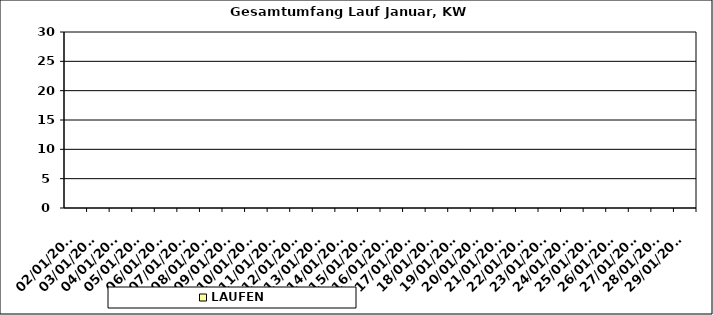
| Category | LAUFEN |
|---|---|
| 02/01/2023 | 0 |
| 03/01/2023 | 0 |
| 04/01/2023 | 0 |
| 05/01/2023 | 0 |
| 06/01/2023 | 0 |
| 07/01/2023 | 0 |
| 08/01/2023 | 0 |
| 09/01/2023 | 0 |
| 10/01/2023 | 0 |
| 11/01/2023 | 0 |
| 12/01/2023 | 0 |
| 13/01/2023 | 0 |
| 14/01/2023 | 0 |
| 15/01/2023 | 0 |
| 16/01/2023 | 0 |
| 17/01/2023 | 0 |
| 18/01/2023 | 0 |
| 19/01/2023 | 0 |
| 20/01/2023 | 0 |
| 21/01/2023 | 0 |
| 22/01/2023 | 0 |
| 23/01/2023 | 0 |
| 24/01/2023 | 0 |
| 25/01/2023 | 0 |
| 26/01/2023 | 0 |
| 27/01/2023 | 0 |
| 28/01/2023 | 0 |
| 29/01/2023 | 0 |